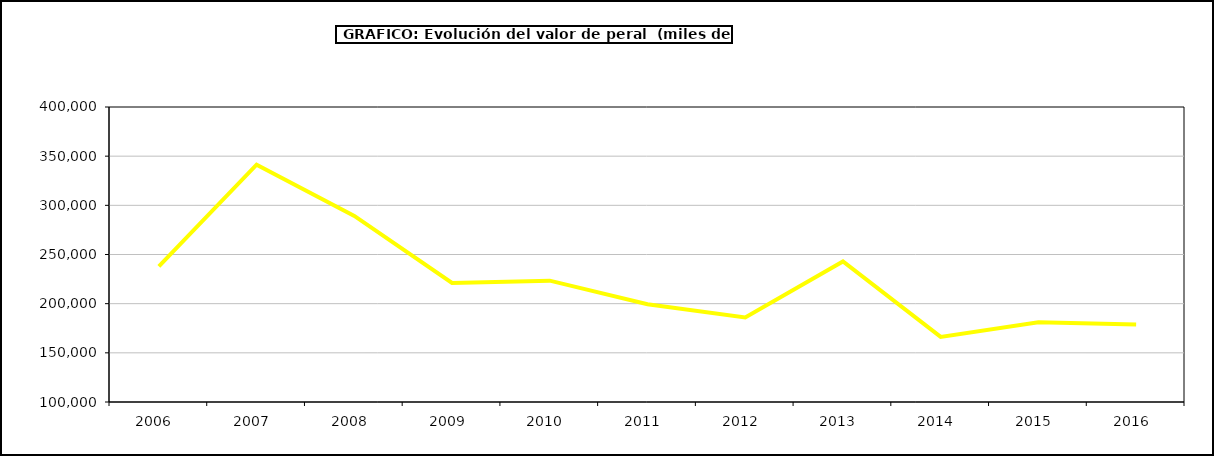
| Category | valor peral |
|---|---|
| 2006.0 | 237958.901 |
| 2007.0 | 341373.173 |
| 2008.0 | 289268.475 |
| 2009.0 | 221127.625 |
| 2010.0 | 223375.858 |
| 2011.0 | 199365.811 |
| 2012.0 | 186031.625 |
| 2013.0 | 242867.092 |
| 2014.0 | 166145.606 |
| 2015.0 | 181166 |
| 2016.0 | 178909 |